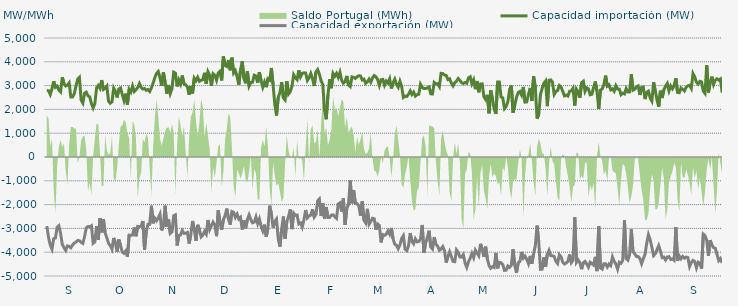
| Category | Capacidad importación (MW) | Capacidad exportación (MW) |
|---|---|---|
| 0 | 2793.75 | -2904.375 |
| 1900-01-01 | 2786.25 | -3382.5 |
| 1900-01-02 | 2626.875 | -3703.125 |
| 1900-01-03 | 2870.625 | -3871.875 |
| 1900-01-04 | 3183.75 | -3431.25 |
| 1900-01-05 | 2926.875 | -3403.125 |
| 1900-01-06 | 2979.375 | -2951.25 |
| 1900-01-07 | 2814.375 | -2887.5 |
| 1900-01-08 | 2737.5 | -3208.125 |
| 1900-01-09 | 3352.5 | -3671.25 |
| 1900-01-10 | 3078.75 | -3808.125 |
| 1900-01-11 | 2983.125 | -3926.25 |
| 1900-01-12 | 3018.75 | -3738.75 |
| 1900-01-13 | 3114.375 | -3751.875 |
| 1900-01-14 | 2520 | -3813.75 |
| 1900-01-15 | 2523.75 | -3697.292 |
| 1900-01-16 | 2658.542 | -3615 |
| 1900-01-17 | 2986.875 | -3575.625 |
| 1900-01-18 | 3273.625 | -3505.833 |
| 1900-01-19 | 3348.75 | -3519.375 |
| 1900-01-20 | 2390.625 | -3592.5 |
| 1900-01-21 | 2265 | -3631.875 |
| 1900-01-22 | 2675.625 | -3346.875 |
| 1900-01-23 | 2724.375 | -2973.75 |
| 1900-01-24 | 2571.875 | -2923.125 |
| 1900-01-25 | 2527.5 | -2930.042 |
| 1900-01-26 | 2244.375 | -2888.708 |
| 1900-01-27 | 2059.333 | -3626.25 |
| 1900-01-28 | 2244.375 | -3570 |
| 1900-01-29 | 2900 | -2900 |
| 1900-01-30 | 3007.5 | -3476.25 |
| 1900-01-31 | 2885.625 | -2562.917 |
| 1900-02-01 | 3233.333 | -3166.667 |
| 1900-02-02 | 2836.875 | -2610.208 |
| 1900-02-03 | 2889.375 | -3189.375 |
| 1900-02-04 | 2979.375 | -3399.375 |
| 1900-02-05 | 2345.625 | -3628.125 |
| 1900-02-06 | 2257.5 | -3725.625 |
| 1900-02-07 | 2323.125 | -3871.875 |
| 1900-02-08 | 2895 | -3401.25 |
| 1900-02-09 | 2760 | -3600 |
| 1900-02-10 | 2503.125 | -3987.75 |
| 1900-02-11 | 2855.625 | -3466.875 |
| 1900-02-12 | 2898.75 | -3720 |
| 1900-02-13 | 2628.75 | -3997.5 |
| 1900-02-14 | 2375.625 | -4044.375 |
| 1900-02-15 | 2660.625 | -3947.875 |
| 1900-02-16 | 2205 | -4190.625 |
| 1900-02-17 | 2840.625 | -3281.25 |
| 1900-02-18 | 2726.25 | -3292.5 |
| 1900-02-19 | 2983.125 | -3279.375 |
| 1900-02-20 | 2750.625 | -2960.625 |
| 1900-02-21 | 2827.5 | -3330 |
| 1900-02-22 | 2917.5 | -2915.625 |
| 1900-02-23 | 3087 | -2927.6 |
| 1900-02-24 | 2928.75 | -2903.792 |
| 1900-02-25 | 2857.5 | -2686.875 |
| 1900-02-26 | 2874.375 | -3894.375 |
| 1900-02-27 | 2803.125 | -3136.875 |
| 1900-02-28 | 2836.875 | -2825.625 |
| 1900-02-28 | 2752.5 | -2825.625 |
| 1900-03-01 | 2906.25 | -2049.375 |
| 1900-03-02 | 3106.875 | -2788.125 |
| 1900-03-03 | 3331.875 | -2572.5 |
| 1900-03-04 | 3513.75 | -2677.5 |
| 1900-03-05 | 3590.625 | -2555.625 |
| 1900-03-06 | 3328.125 | -2400 |
| 1900-03-07 | 2992.5 | -3084.375 |
| 1900-03-08 | 3551.25 | -2874.375 |
| 1900-03-09 | 3150 | -2045.625 |
| 1900-03-10 | 2658.75 | -2932.5 |
| 1900-03-11 | 3023.625 | -2619.5 |
| 1900-03-12 | 2664.375 | -3210 |
| 1900-03-13 | 2872.5 | -3142.5 |
| 1900-03-14 | 3564.375 | -2467.5 |
| 1900-03-15 | 3525 | -2430 |
| 1900-03-16 | 2966.25 | -3718.125 |
| 1900-03-17 | 3236.25 | -3300 |
| 1900-03-18 | 3069.375 | -3275.625 |
| 1900-03-19 | 3425.625 | -3086.25 |
| 1900-03-20 | 3071.25 | -3204.375 |
| 1900-03-21 | 3031.875 | -3206.25 |
| 1900-03-22 | 2947.5 | -3172.5 |
| 1900-03-23 | 2613.75 | -3633.75 |
| 1900-03-24 | 2977.5 | -3258.75 |
| 1900-03-25 | 2670 | -2689.583 |
| 1900-03-26 | 3315 | -3045 |
| 1900-03-27 | 3206.25 | -3523.125 |
| 1900-03-28 | 3348.75 | -2850 |
| 1900-03-29 | 3181.875 | -3038.125 |
| 1900-03-30 | 3225 | -3354.375 |
| 1900-03-31 | 3249.375 | -3283.125 |
| 1900-04-01 | 3536.25 | -3127.5 |
| 1900-04-02 | 3078.75 | -3241.875 |
| 1900-04-03 | 3578.333 | -2647.5 |
| 1900-04-04 | 3425.625 | -3048.75 |
| 1900-04-05 | 2990 | -2885.625 |
| 1900-04-06 | 3498.75 | -2733.75 |
| 1900-04-07 | 3433.125 | -2840.625 |
| 1900-04-08 | 3225 | -3326.25 |
| 1900-04-09 | 3534.375 | -2242.5 |
| 1900-04-10 | 3600 | -2760 |
| 1900-04-11 | 3215.625 | -3054.375 |
| 1900-04-12 | 4224.75 | -2629.167 |
| 1900-04-13 | 3843.75 | -2460 |
| 1900-04-14 | 3802.5 | -2167.5 |
| 1900-04-15 | 4076.25 | -2617.5 |
| 1900-04-16 | 3645 | -2842.5 |
| 1900-04-17 | 4173.75 | -2293.125 |
| 1900-04-18 | 3528.75 | -2328.75 |
| 1900-04-19 | 3628.125 | -2536.875 |
| 1900-04-20 | 3371.25 | -2401.875 |
| 1900-04-21 | 3033.75 | -2606.25 |
| 1900-04-22 | 3658.125 | -2535 |
| 1900-04-23 | 4021.875 | -3046.875 |
| 1900-04-24 | 3286.875 | -2666.25 |
| 1900-04-25 | 3097.5 | -2992.5 |
| 1900-04-26 | 3598.125 | -2625 |
| 1900-04-27 | 2981.25 | -2431.875 |
| 1900-04-28 | 3131.042 | -2628.75 |
| 1900-04-29 | 3142.5 | -2765.625 |
| 1900-04-30 | 3436.875 | -2737.5 |
| 1900-05-01 | 3403.125 | -2520 |
| 1900-05-02 | 3114.375 | -2795.625 |
| 1900-05-03 | 3568.125 | -2604.375 |
| 1900-05-04 | 3206.25 | -2913.75 |
| 1900-05-05 | 2931.042 | -3104.125 |
| 1900-05-06 | 3150 | -2842.75 |
| 1900-05-07 | 2933.875 | -3349.75 |
| 1900-05-08 | 3287.292 | -2997.25 |
| 1900-05-09 | 3230.625 | -2043.75 |
| 1900-05-10 | 3740.417 | -2390.833 |
| 1900-05-11 | 3032.708 | -2969.125 |
| 1900-05-12 | 2212.5 | -2711.25 |
| 1900-05-13 | 1744.583 | -2608.958 |
| 1900-05-14 | 2509.583 | -3447.25 |
| 1900-05-15 | 2711.25 | -3765 |
| 1900-05-16 | 3146.25 | -3022.5 |
| 1900-05-17 | 2484.375 | -2501.875 |
| 1900-05-18 | 2400 | -3436.875 |
| 1900-05-19 | 3185.625 | -2718.75 |
| 1900-05-20 | 2647.5 | -2503.125 |
| 1900-05-21 | 2745 | -2206.875 |
| 1900-05-22 | 2960.625 | -3030 |
| 1900-05-23 | 3457.5 | -2362.5 |
| 1900-05-24 | 3331.875 | -2454.375 |
| 1900-05-25 | 3251.25 | -2439.375 |
| 1900-05-26 | 3643.125 | -2812.5 |
| 1900-05-27 | 3367.5 | -2769.375 |
| 1900-05-28 | 3511.875 | -2945.625 |
| 1900-05-29 | 3538.125 | -2640 |
| 1900-05-30 | 3528.75 | -2227.5 |
| 1900-05-31 | 3215.625 | -2556.917 |
| 1900-06-01 | 3330 | -2475 |
| 1900-06-02 | 3511.875 | -2439.375 |
| 1900-06-03 | 3300 | -2195.625 |
| 1900-06-04 | 2985.208 | -2525.625 |
| 1900-06-05 | 3570 | -2416.875 |
| 1900-06-06 | 3673.125 | -1837.5 |
| 1900-06-07 | 3483.75 | -1764.375 |
| 1900-06-08 | 3198.75 | -2480.625 |
| 1900-06-09 | 3052.5 | -1938.75 |
| 1900-06-10 | 1974.375 | -2591.25 |
| 1900-06-11 | 1586.25 | -2103.75 |
| 1900-06-12 | 2604.375 | -2542.5 |
| 1900-06-13 | 3268.125 | -2536.875 |
| 1900-06-14 | 2891.25 | -2441.25 |
| 1900-06-15 | 3510 | -2430.375 |
| 1900-06-16 | 3390 | -2512.5 |
| 1900-06-17 | 3511.875 | -2578.125 |
| 1900-06-18 | 3343.125 | -1972.5 |
| 1900-06-19 | 3558.75 | -1927.5 |
| 1900-06-20 | 3223.125 | -2289.375 |
| 1900-06-21 | 3101.25 | -1732.083 |
| 1900-06-22 | 3165 | -2851.875 |
| 1900-06-23 | 3405 | -2163.75 |
| 1900-06-24 | 3025 | -1996.875 |
| 1900-06-25 | 2958.75 | -985 |
| 1900-06-26 | 3365.625 | -1948.125 |
| 1900-06-27 | 3345 | -1394.375 |
| 1900-06-28 | 3300 | -1944.667 |
| 1900-06-29 | 3373.125 | -1960.375 |
| 1900-06-30 | 3412.5 | -2045 |
| 1900-07-01 | 3406.875 | -2470.625 |
| 1900-07-02 | 3238.125 | -1861.875 |
| 1900-07-03 | 3271.875 | -2651.25 |
| 1900-07-04 | 3097.5 | -2765.625 |
| 1900-07-05 | 3156.75 | -2177.375 |
| 1900-07-06 | 3271.875 | -2821.875 |
| 1900-07-07 | 3142.5 | -2711.25 |
| 1900-07-08 | 3320.625 | -2572.5 |
| 1900-07-09 | 3423.75 | -2593.75 |
| 1900-07-10 | 3369.375 | -3054.375 |
| 1900-07-11 | 3255 | -2812.5 |
| 1900-07-12 | 3003.75 | -2874.375 |
| 1900-07-13 | 3243.75 | -3588.75 |
| 1900-07-14 | 3260.625 | -3258.75 |
| 1900-07-15 | 3015.625 | -3294.375 |
| 1900-07-16 | 3191.25 | -3247.5 |
| 1900-07-17 | 3106.875 | -3105 |
| 1900-07-18 | 3283.125 | -3245.625 |
| 1900-07-19 | 2878.125 | -2981.25 |
| 1900-07-20 | 3118.125 | -3433.125 |
| 1900-07-21 | 3270 | -3667.5 |
| 1900-07-22 | 3052.5 | -3708.75 |
| 1900-07-23 | 2932.5 | -3853.125 |
| 1900-07-24 | 3183.75 | -3691.875 |
| 1900-07-25 | 2970 | -3425.625 |
| 1900-07-26 | 2502.391 | -3308.478 |
| 1900-07-27 | 2557.5 | -3871.875 |
| 1900-07-28 | 2544.375 | -3935.625 |
| 1900-07-29 | 2636.25 | -3740.625 |
| 1900-07-30 | 2778.75 | -3196.875 |
| 1900-07-31 | 2628.75 | -3541.875 |
| 1900-08-01 | 2728.125 | -3646.667 |
| 1900-08-02 | 2557.5 | -3436.875 |
| 1900-08-03 | 2619.375 | -3562.5 |
| 1900-08-04 | 2636.25 | -3549.375 |
| 1900-08-05 | 3056.25 | -3453.75 |
| 1900-08-06 | 2925 | -2854.5 |
| 1900-08-07 | 2874.375 | -4029.375 |
| 1900-08-08 | 2876.25 | -3616.875 |
| 1900-08-09 | 2900.625 | -3388.125 |
| 1900-08-10 | 2941.875 | -3097.5 |
| 1900-08-11 | 2653.125 | -3780 |
| 1900-08-12 | 2647.5 | -3864.375 |
| 1900-08-13 | 3133.125 | -3371.25 |
| 1900-08-14 | 3069.375 | -3673.125 |
| 1900-08-15 | 3082.5 | -3740.625 |
| 1900-08-16 | 2958.75 | -3920.625 |
| 1900-08-17 | 3513.75 | -3864.375 |
| 1900-08-18 | 3506.25 | -3763.125 |
| 1900-08-19 | 3446.25 | -3937.5 |
| 1900-08-20 | 3425.625 | -4440 |
| 1900-08-21 | 3253.125 | -4179.375 |
| 1900-08-22 | 3285 | -3980.417 |
| 1900-08-23 | 3105 | -4185 |
| 1900-08-24 | 2985 | -4387.5 |
| 1900-08-25 | 3123.75 | -4398.75 |
| 1900-08-26 | 3189.375 | -3905.625 |
| 1900-08-27 | 3298.125 | -4003.125 |
| 1900-08-28 | 3215.625 | -4200 |
| 1900-08-29 | 3121.875 | -4207.5 |
| 1900-08-30 | 3090 | -4100.625 |
| 1900-08-31 | 3133.125 | -4455 |
| 1900-09-01 | 3101.25 | -4636.875 |
| 1900-09-02 | 3324.375 | -4408.125 |
| 1900-09-03 | 3371.25 | -4248.75 |
| 1900-09-04 | 3075 | -4050 |
| 1900-09-05 | 3240 | -4228.125 |
| 1900-09-06 | 2850 | -3910 |
| 1900-09-07 | 3191.25 | -4035 |
| 1900-09-08 | 2720.625 | -4149.375 |
| 1900-09-09 | 3065.625 | -3648.75 |
| 1900-09-10 | 3075 | -3862.5 |
| 1900-09-11 | 2529.375 | -4198.125 |
| 1900-09-12 | 2418.75 | -3766.875 |
| 1900-09-13 | 2611.875 | -4272.292 |
| 1900-09-14 | 1836.25 | -4563.75 |
| 1900-09-15 | 2797.5 | -4674.375 |
| 1900-09-16 | 2448.75 | -4601.25 |
| 1900-09-17 | 2016.917 | -4637.083 |
| 1900-09-18 | 1812.292 | -4032.083 |
| 1900-09-19 | 3151.875 | -4680 |
| 1900-09-20 | 3150 | -4422.708 |
| 1900-09-21 | 2521.875 | -4441.875 |
| 1900-09-22 | 2488.333 | -4522.5 |
| 1900-09-23 | 2032.708 | -4766.25 |
| 1900-09-24 | 2126.25 | -4753.125 |
| 1900-09-25 | 2332.5 | -4578.75 |
| 1900-09-26 | 2836.875 | -4636.875 |
| 1900-09-27 | 2998.125 | -4548.75 |
| 1900-09-28 | 1860 | -3875.625 |
| 1900-09-29 | 2173.125 | -4548.75 |
| 1900-09-30 | 2501.25 | -4869.375 |
| 1900-10-01 | 2709.375 | -4443.75 |
| 1900-10-02 | 2754.375 | -4389.375 |
| 1900-10-03 | 2602.5 | -3988.125 |
| 1900-10-04 | 2943.75 | -4250.625 |
| 1900-10-05 | 2304.917 | -4167.5 |
| 1900-10-06 | 2317.5 | -4303.125 |
| 1900-10-07 | 2636.25 | -4481.25 |
| 1900-10-08 | 2900.625 | -4155 |
| 1900-10-09 | 2354.375 | -4488.75 |
| 1900-10-10 | 3395.625 | -4059.375 |
| 1900-10-11 | 2919.375 | -3729.375 |
| 1900-10-12 | 1612.5 | -2879.583 |
| 1900-10-13 | 1777.708 | -3564.375 |
| 1900-10-14 | 2624.875 | -4719.375 |
| 1900-10-15 | 2883.75 | -4711.875 |
| 1900-10-16 | 3101.25 | -4216.875 |
| 1900-10-17 | 3193.125 | -4616.25 |
| 1900-10-18 | 2137.5 | -4083.75 |
| 1900-10-19 | 3221.25 | -3922.5 |
| 1900-10-20 | 3238.125 | -4143.75 |
| 1900-10-21 | 3146.25 | -4149.375 |
| 1900-10-22 | 2629.583 | -4181.25 |
| 1900-10-23 | 2756.25 | -4383.75 |
| 1900-10-24 | 2791.875 | -4475.625 |
| 1900-10-25 | 3005.625 | -4110 |
| 1900-10-26 | 2943.75 | -4190.625 |
| 1900-10-27 | 2761.875 | -4417.5 |
| 1900-10-28 | 2566.875 | -4494.375 |
| 1900-10-29 | 2602.5 | -4453.125 |
| 1900-10-30 | 2561.25 | -4380 |
| 1900-10-31 | 2763.75 | -4098.75 |
| 1900-11-01 | 2769.375 | -4436.25 |
| 1900-11-02 | 2887.5 | -4333.125 |
| 1900-11-03 | 2159.625 | -2520.833 |
| 1900-11-04 | 2846.25 | -4423.125 |
| 1900-11-05 | 2730 | -4323.75 |
| 1900-11-06 | 2491.875 | -4438.125 |
| 1900-11-07 | 3123.75 | -4711.875 |
| 1900-11-08 | 3183.75 | -4440 |
| 1900-11-09 | 2761.875 | -4387.5 |
| 1900-11-10 | 2908.125 | -4496.25 |
| 1900-11-11 | 2861.25 | -4627.5 |
| 1900-11-12 | 2615.625 | -4421.25 |
| 1900-11-13 | 2636.25 | -4479.375 |
| 1900-11-14 | 2925 | -4541.25 |
| 1900-11-15 | 3172.917 | -4194.583 |
| 1900-11-16 | 2752.5 | -4794.375 |
| 1900-11-17 | 2024.208 | -2912.083 |
| 1900-11-18 | 2810.625 | -4661.25 |
| 1900-11-19 | 2859.375 | -4710 |
| 1900-11-20 | 3043.125 | -4486.875 |
| 1900-11-21 | 3418.125 | -4485 |
| 1900-11-22 | 2977.5 | -4623.75 |
| 1900-11-23 | 3028.125 | -4498.125 |
| 1900-11-24 | 2820 | -4565.625 |
| 1900-11-25 | 2863.125 | -4200 |
| 1900-11-26 | 2761.875 | -4381.875 |
| 1900-11-27 | 2994.375 | -4500 |
| 1900-11-28 | 2857.5 | -4715.625 |
| 1900-11-29 | 2850 | -4423.125 |
| 1900-11-30 | 2617.5 | -4466.25 |
| 1900-12-01 | 2681.25 | -4346.25 |
| 1900-12-02 | 2650 | -2650 |
| 1900-12-03 | 2876.25 | -4267.5 |
| 1900-12-04 | 2733.333 | -4333.125 |
| 1900-12-05 | 2735.625 | -4098.75 |
| 1900-12-06 | 3479.167 | -3041.667 |
| 1900-12-07 | 2805 | -3984.375 |
| 1900-12-08 | 2846.25 | -4065 |
| 1900-12-09 | 2941.875 | -4177.5 |
| 1900-12-10 | 2985 | -4183.125 |
| 1900-12-11 | 2606.25 | -4265.625 |
| 1900-12-12 | 2921.25 | -4481.25 |
| 1900-12-13 | 2938.125 | -4273.125 |
| 1900-12-14 | 2435 | -4091.25 |
| 1900-12-15 | 2716.875 | -3618.75 |
| 1900-12-16 | 2767.5 | -3264.375 |
| 1900-12-17 | 2476.875 | -3474.375 |
| 1900-12-18 | 2349.375 | -3798.75 |
| 1900-12-19 | 3142.5 | -4141.875 |
| 1900-12-20 | 2773.125 | -4066.875 |
| 1900-12-21 | 2390.625 | -3896.25 |
| 1900-12-22 | 2113.125 | -3723.75 |
| 1900-12-23 | 2786.25 | -3954.375 |
| 1900-12-24 | 2480.625 | -4226.25 |
| 1900-12-25 | 2829.375 | -4203.75 |
| 1900-12-26 | 2973.75 | -4323.75 |
| 1900-12-27 | 3090 | -4200 |
| 1900-12-28 | 2778.75 | -4186.875 |
| 1900-12-29 | 2986.875 | -4305 |
| 1900-12-30 | 2868.75 | -4282.5 |
| 1900-12-31 | 3000 | -4340.625 |
| 1901-01-01 | 3307.5 | -2947.5 |
| 1901-01-02 | 2713.125 | -4359.375 |
| 1901-01-03 | 2701.875 | -4158.75 |
| 1901-01-04 | 2896.875 | -4276.875 |
| 1901-01-05 | 2842.5 | -4177.5 |
| 1901-01-06 | 2773.125 | -4254.375 |
| 1901-01-07 | 2930.625 | -4201.875 |
| 1901-01-08 | 2990.625 | -4224.375 |
| 1901-01-09 | 3015 | -4603.125 |
| 1901-01-10 | 2883.75 | -4436.25 |
| 1901-01-11 | 3506.25 | -4342.5 |
| 1901-01-12 | 3367.5 | -4393.125 |
| 1901-01-13 | 3144.375 | -4653.75 |
| 1901-01-14 | 3063.75 | -4419.375 |
| 1901-01-15 | 3178.125 | -4456.875 |
| 1901-01-16 | 3153.75 | -4695 |
| 1901-01-17 | 2768.542 | -3240.125 |
| 1901-01-18 | 2672.083 | -3304.625 |
| 1901-01-19 | 3855 | -3498.75 |
| 1901-01-20 | 2703.125 | -4151.25 |
| 1901-01-21 | 3123.333 | -3495.125 |
| 1901-01-22 | 3376.875 | -3697.5 |
| 1901-01-23 | 3048.75 | -3805.875 |
| 1901-01-24 | 3225 | -3836.25 |
| 1901-01-25 | 3286.875 | -4085.625 |
| 1901-01-26 | 3230.625 | -4353.75 |
| 1901-01-27 | 3279.375 | -4267.5 |
| 1901-01-28 | 2704.917 | -4449.375 |